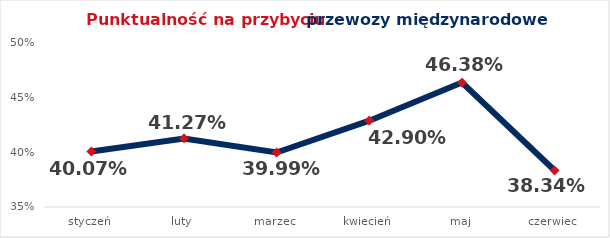
| Category | Series 0 |
|---|---|
| styczeń | 0.401 |
| luty | 0.413 |
| marzec | 0.4 |
| kwiecień | 0.429 |
| maj | 0.464 |
| czerwiec | 0.383 |